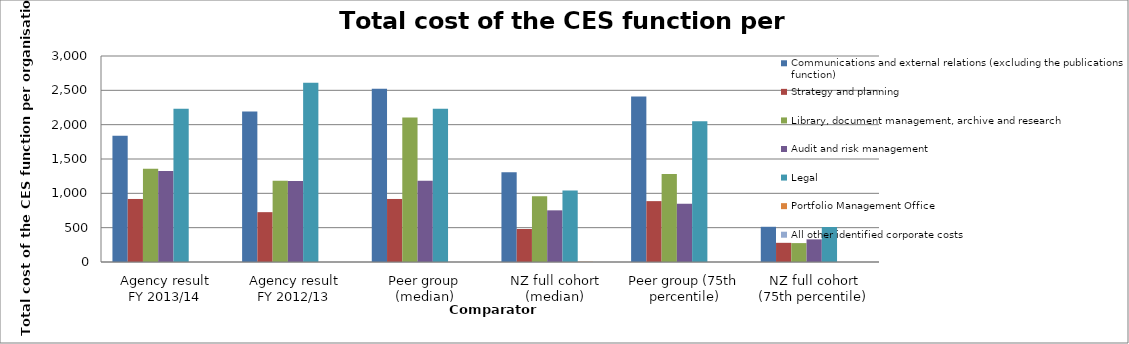
| Category | Communications and external relations (excluding the publications function) | Strategy and planning | Library, document management, archive and research | Audit and risk management | Legal | Portfolio Management Office | All other identified corporate costs |
|---|---|---|---|---|---|---|---|
| Agency result
FY 2013/14 | 1838.244 | 917.948 | 1359.314 | 1324.099 | 2230.309 | 0 | 0 |
| Agency result
FY 2012/13 | 2190.476 | 725.869 | 1181.467 | 1178.893 | 2610.039 | 0 | 0 |
| Peer group (median) | 2521.408 | 917.948 | 2102.759 | 1184.343 | 2230.309 | 0 | 0 |
| NZ full cohort (median) | 1305.758 | 480.41 | 959.186 | 752.332 | 1042.651 | 3.298 | 0 |
| Peer group (75th percentile) | 2408.673 | 886.518 | 1281.725 | 849.418 | 2050.79 | 0 | 0 |
| NZ full cohort (75th percentile) | 512.811 | 279.24 | 275.363 | 329.715 | 509.63 | 0 | 0 |